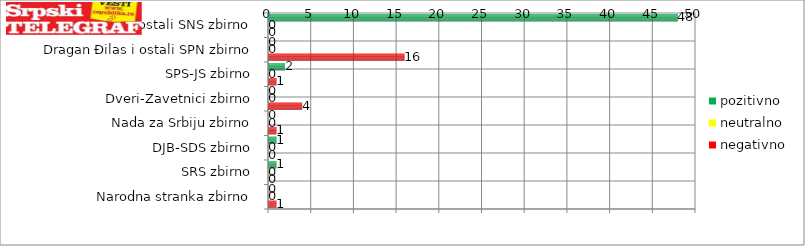
| Category | pozitivno | neutralno | negativno |
|---|---|---|---|
| Aleksandar Vučić i ostali SNS zbirno | 48 | 0 | 0 |
| Dragan Đilas i ostali SPN zbirno | 0 | 0 | 16 |
| SPS-JS zbirno | 2 | 0 | 1 |
| Dveri-Zavetnici zbirno | 0 | 0 | 4 |
| Nada za Srbiju zbirno | 0 | 0 | 1 |
| DJB-SDS zbirno | 1 | 0 | 0 |
| SRS zbirno | 1 | 0 | 0 |
| Narodna stranka zbirno | 0 | 0 | 1 |